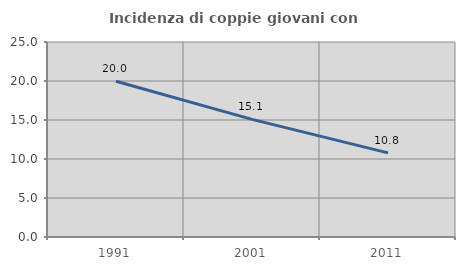
| Category | Incidenza di coppie giovani con figli |
|---|---|
| 1991.0 | 19.965 |
| 2001.0 | 15.078 |
| 2011.0 | 10.783 |